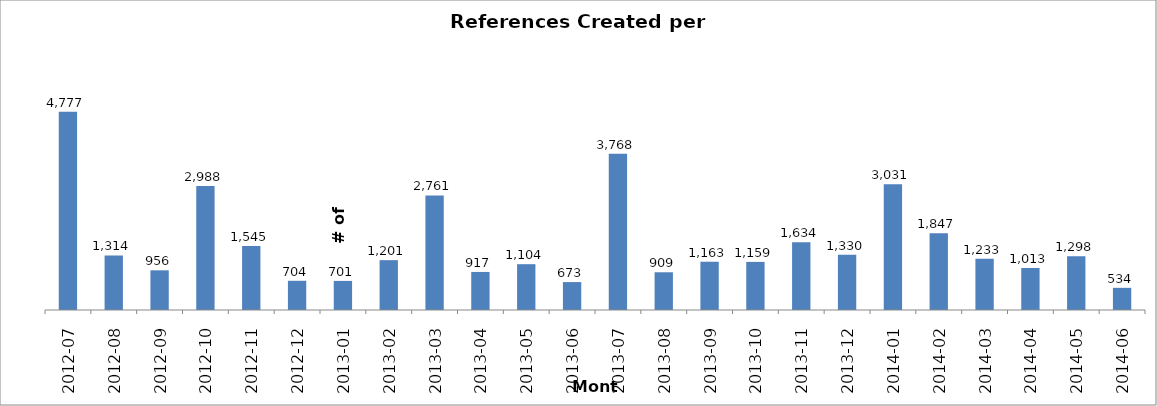
| Category | Series 0 |
|---|---|
| 2014-06 | 534 |
| 2014-05 | 1298 |
| 2014-04 | 1013 |
| 2014-03 | 1233 |
| 2014-02 | 1847 |
| 2014-01 | 3031 |
| 2013-12 | 1330 |
| 2013-11 | 1634 |
| 2013-10 | 1159 |
| 2013-09 | 1163 |
| 2013-08 | 909 |
| 2013-07 | 3768 |
| 2013-06 | 673 |
| 2013-05 | 1104 |
| 2013-04 | 917 |
| 2013-03 | 2761 |
| 2013-02 | 1201 |
| 2013-01 | 701 |
| 2012-12 | 704 |
| 2012-11 | 1545 |
| 2012-10 | 2988 |
| 2012-09 | 956 |
| 2012-08 | 1314 |
| 2012-07 | 4777 |